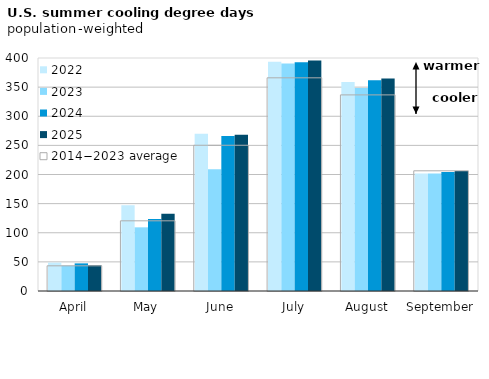
| Category | 2022 | 2023 | 2024 | 2025 |
|---|---|---|---|---|
| April | 48.756 | 43.644 | 47.434 | 44.424 |
| May | 147.283 | 109.304 | 123.477 | 132.613 |
| June | 269.801 | 209.139 | 266.121 | 268.236 |
| July | 393.735 | 390.475 | 392.872 | 395.796 |
| August | 358.799 | 348.521 | 361.849 | 364.594 |
| September | 201.858 | 201.632 | 204.145 | 205.836 |